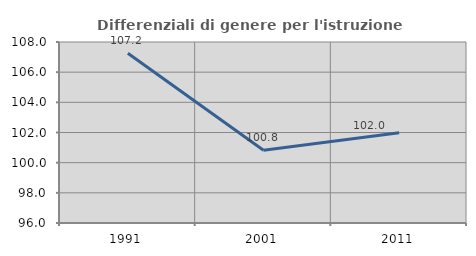
| Category | Differenziali di genere per l'istruzione superiore |
|---|---|
| 1991.0 | 107.249 |
| 2001.0 | 100.823 |
| 2011.0 | 101.986 |